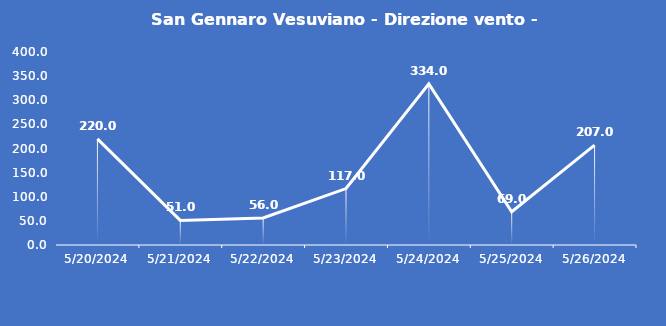
| Category | San Gennaro Vesuviano - Direzione vento - Grezzo (°N) |
|---|---|
| 5/20/24 | 220 |
| 5/21/24 | 51 |
| 5/22/24 | 56 |
| 5/23/24 | 117 |
| 5/24/24 | 334 |
| 5/25/24 | 69 |
| 5/26/24 | 207 |